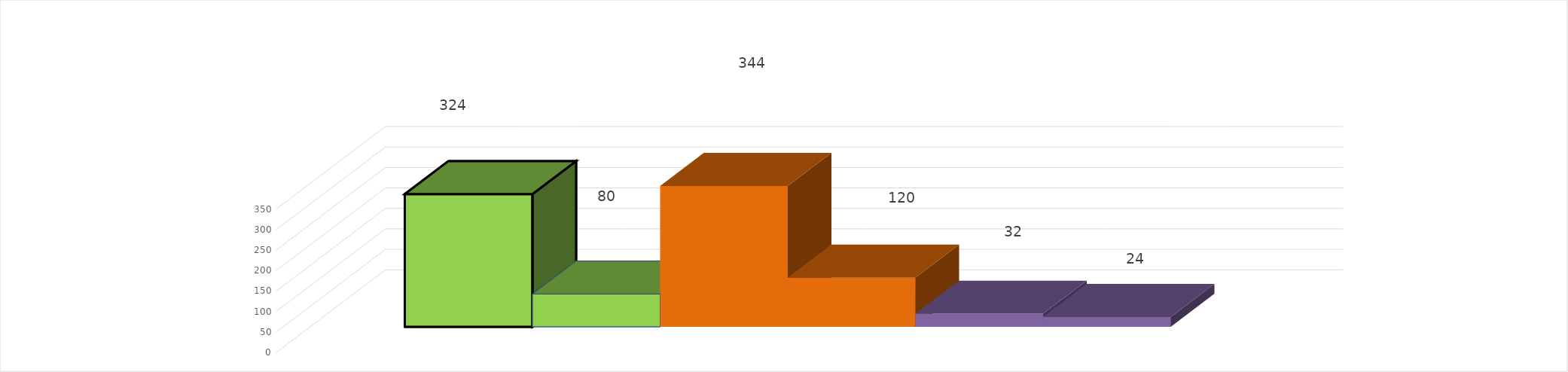
| Category | 1 квартал 2019 год | 1 квартал 2020 год |
|---|---|---|
| 0 | 32 | 24 |